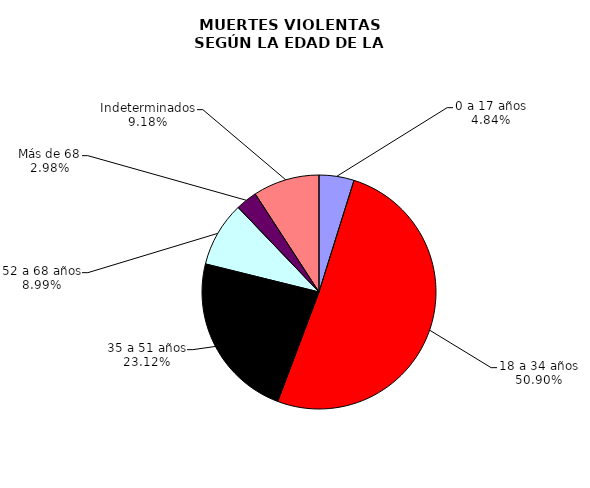
| Category | Series 0 |
|---|---|
| 0 a 17 años | 78 |
| 18 a 34 años | 821 |
| 35 a 51 años | 373 |
| 52 a 68 años | 145 |
| Más de 68 | 48 |
| Indeterminados | 148 |